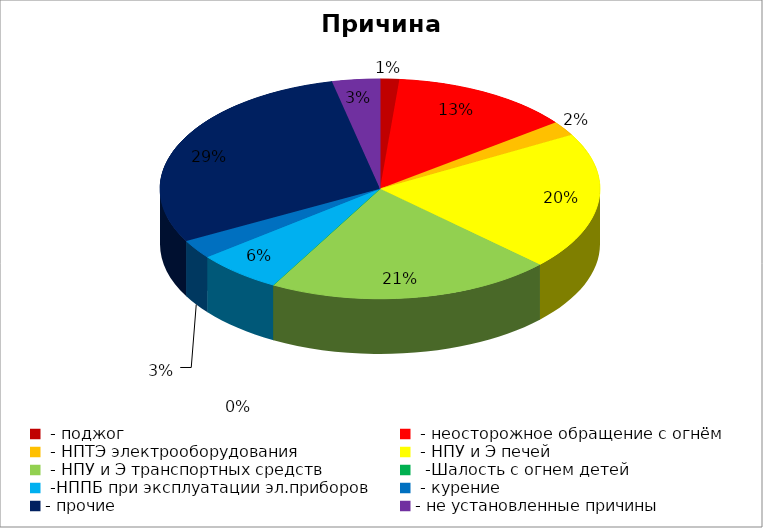
| Category | Причина пожара |
|---|---|
|  - поджог | 2 |
|  - неосторожное обращение с огнём | 19 |
|  - НПТЭ электрооборудования | 3 |
|  - НПУ и Э печей | 29 |
|  - НПУ и Э транспортных средств | 30 |
|   -Шалость с огнем детей | 0 |
|  -НППБ при эксплуатации эл.приборов | 9 |
|  - курение | 4 |
| - прочие | 42 |
| - не установленные причины | 5 |